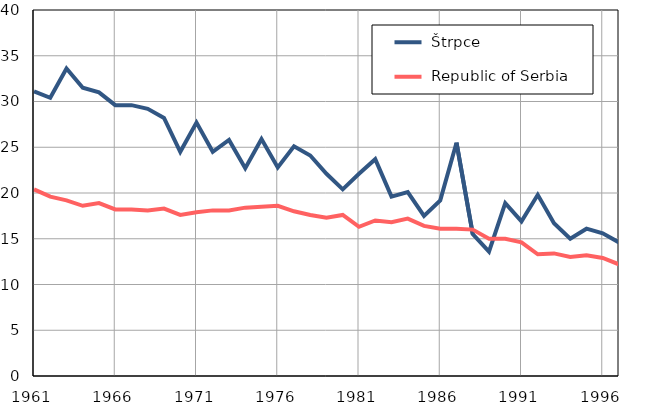
| Category |  Štrpce |  Republic of Serbia |
|---|---|---|
| 1961.0 | 31.1 | 20.4 |
| 1962.0 | 30.4 | 19.6 |
| 1963.0 | 33.6 | 19.2 |
| 1964.0 | 31.5 | 18.6 |
| 1965.0 | 31 | 18.9 |
| 1966.0 | 29.6 | 18.2 |
| 1967.0 | 29.6 | 18.2 |
| 1968.0 | 29.2 | 18.1 |
| 1969.0 | 28.2 | 18.3 |
| 1970.0 | 24.5 | 17.6 |
| 1971.0 | 27.7 | 17.9 |
| 1972.0 | 24.5 | 18.1 |
| 1973.0 | 25.8 | 18.1 |
| 1974.0 | 22.7 | 18.4 |
| 1975.0 | 25.9 | 18.5 |
| 1976.0 | 22.8 | 18.6 |
| 1977.0 | 25.1 | 18 |
| 1978.0 | 24.1 | 17.6 |
| 1979.0 | 22.1 | 17.3 |
| 1980.0 | 20.4 | 17.6 |
| 1981.0 | 22.1 | 16.3 |
| 1982.0 | 23.7 | 17 |
| 1983.0 | 19.6 | 16.8 |
| 1984.0 | 20.1 | 17.2 |
| 1985.0 | 17.5 | 16.4 |
| 1986.0 | 19.2 | 16.1 |
| 1987.0 | 25.5 | 16.1 |
| 1988.0 | 15.5 | 16 |
| 1989.0 | 13.6 | 15 |
| 1990.0 | 18.9 | 15 |
| 1991.0 | 16.9 | 14.6 |
| 1992.0 | 19.8 | 13.3 |
| 1993.0 | 16.7 | 13.4 |
| 1994.0 | 15 | 13 |
| 1995.0 | 16.1 | 13.2 |
| 1996.0 | 15.6 | 12.9 |
| 1997.0 | 14.6 | 12.2 |